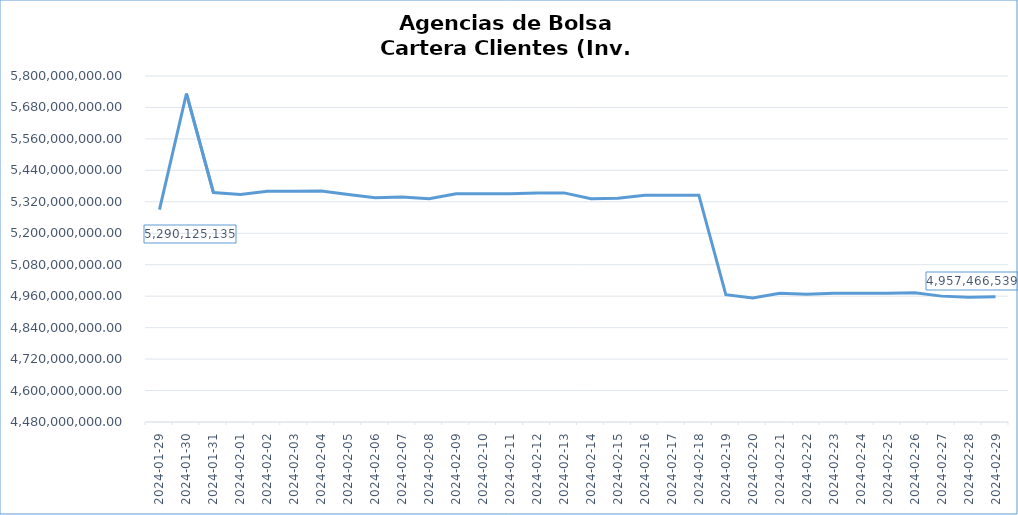
| Category | INV. LOCALES |
|---|---|
| 2024-01-29 | 5290125135.49 |
| 2024-01-30 | 5733107005.79 |
| 2024-01-31 | 5355342762.83 |
| 2024-02-01 | 5347712498.4 |
| 2024-02-02 | 5360487721.89 |
| 2024-02-03 | 5360517599.07 |
| 2024-02-04 | 5360951853.99 |
| 2024-02-05 | 5348271071.06 |
| 2024-02-06 | 5335503284.53 |
| 2024-02-07 | 5338094671.45 |
| 2024-02-08 | 5331564048.28 |
| 2024-02-09 | 5350790359.62 |
| 2024-02-10 | 5350862096.23 |
| 2024-02-11 | 5351151499.96 |
| 2024-02-12 | 5353663038.89 |
| 2024-02-13 | 5354031392.42 |
| 2024-02-14 | 5331871816.79 |
| 2024-02-15 | 5334023799.12 |
| 2024-02-16 | 5344896023.92 |
| 2024-02-17 | 5345011581.23 |
| 2024-02-18 | 5345431191.25 |
| 2024-02-19 | 4965542439.4 |
| 2024-02-20 | 4952843976.09 |
| 2024-02-21 | 4970715918.52 |
| 2024-02-22 | 4967065610.77 |
| 2024-02-23 | 4970926358.91 |
| 2024-02-24 | 4971337485.8 |
| 2024-02-25 | 4970998977.32 |
| 2024-02-26 | 4973449323.33 |
| 2024-02-27 | 4960214313.54 |
| 2024-02-28 | 4956325200.67 |
| 2024-02-29 | 4957466539.15 |